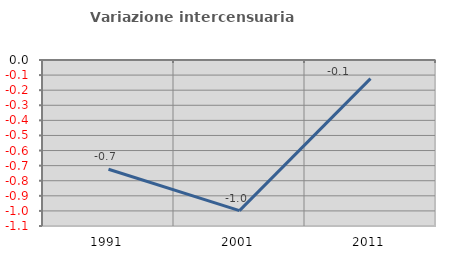
| Category | Variazione intercensuaria annua |
|---|---|
| 1991.0 | -0.724 |
| 2001.0 | -0.998 |
| 2011.0 | -0.123 |